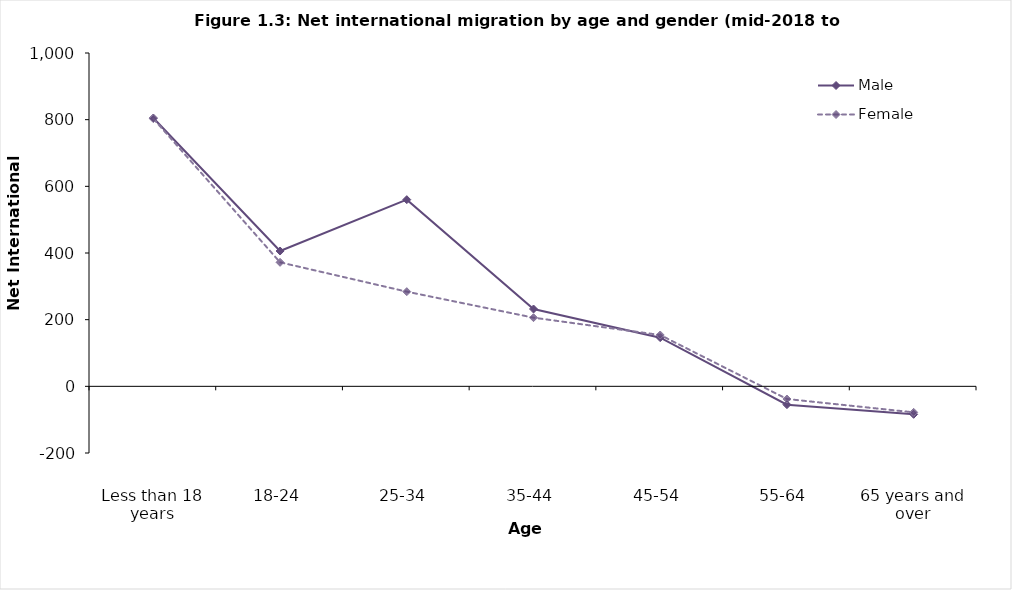
| Category | Male  | Female |
|---|---|---|
| Less than 18 years | 805 | 803 |
| 18-24 | 406 | 372 |
| 25-34 | 560 | 284 |
| 35-44 | 232 | 206 |
| 45-54 | 146 | 154 |
| 55-64 | -55 | -38 |
| 65 years and over | -84 | -78 |